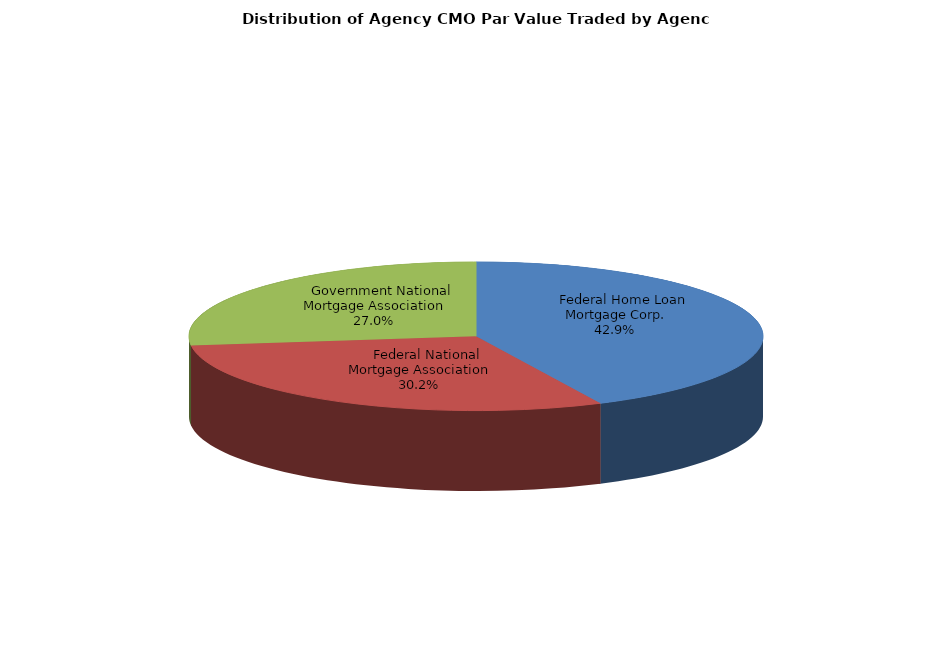
| Category | Series 0 |
|---|---|
|     Federal Home Loan Mortgage Corp. | 2561875706.956 |
|     Federal National Mortgage Association | 1803508806.288 |
|     Government National Mortgage Association | 1610722890.374 |